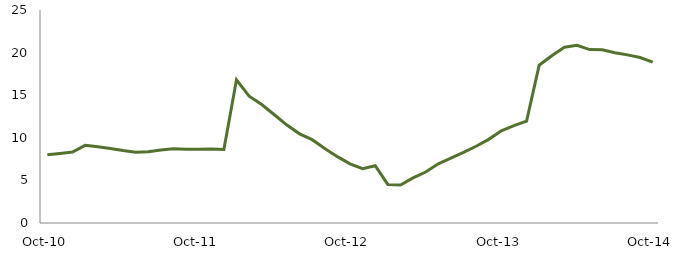
| Category | Series 0 |
|---|---|
| Oct-10 | 8.018 |
|  | 8.154 |
|  | 8.321 |
|  | 9.117 |
|  | 8.961 |
|  | 8.741 |
|  | 8.504 |
|  | 8.316 |
|  | 8.351 |
|  | 8.556 |
|  | 8.708 |
|  | 8.67 |
| Oct-11 | 8.643 |
|  | 8.672 |
|  | 8.638 |
|  | 16.809 |
|  | 14.88 |
|  | 13.91 |
|  | 12.702 |
|  | 11.496 |
|  | 10.465 |
|  | 9.782 |
|  | 8.747 |
|  | 7.788 |
| Oct-12 | 6.94 |
|  | 6.368 |
|  | 6.725 |
|  | 4.528 |
|  | 4.462 |
|  | 5.288 |
|  | 5.982 |
|  | 6.95 |
|  | 7.6 |
|  | 8.282 |
|  | 9.007 |
|  | 9.818 |
| Oct-13 | 10.818 |
|  | 11.424 |
|  | 11.963 |
|  | 18.523 |
|  | 19.632 |
|  | 20.625 |
|  | 20.848 |
|  | 20.351 |
|  | 20.33 |
|  | 19.98 |
|  | 19.734 |
|  | 19.427 |
| Oct-14 | 18.885 |